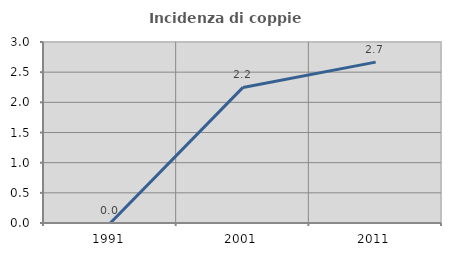
| Category | Incidenza di coppie miste |
|---|---|
| 1991.0 | 0 |
| 2001.0 | 2.247 |
| 2011.0 | 2.667 |